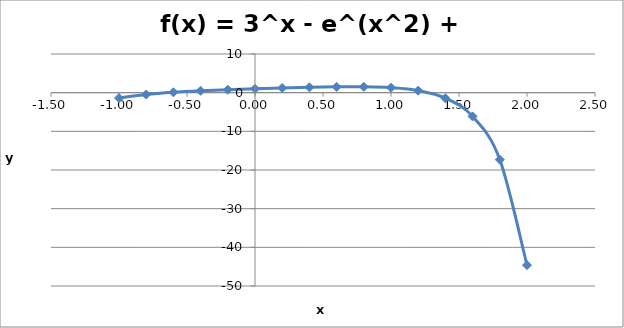
| Category | Series 0 |
|---|---|
| -1.0 | -1.385 |
| -0.8 | -0.481 |
| -0.6000000000000001 | 0.084 |
| -0.4000000000000001 | 0.471 |
| -0.20000000000000007 | 0.762 |
| 0.0 | 1 |
| 0.2 | 1.205 |
| 0.4 | 1.378 |
| 0.6000000000000001 | 1.5 |
| 0.8 | 1.512 |
| 1.0 | 1.282 |
| 1.2 | 0.516 |
| 1.4 | -1.444 |
| 1.5999999999999999 | -6.136 |
| 1.7999999999999998 | -17.309 |
| 1.9999999999999998 | -44.598 |